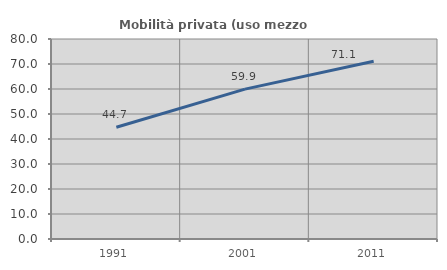
| Category | Mobilità privata (uso mezzo privato) |
|---|---|
| 1991.0 | 44.719 |
| 2001.0 | 59.942 |
| 2011.0 | 71.069 |